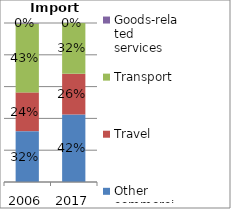
| Category | Other commercial services | Travel | Transport | Goods-related services |
|---|---|---|---|---|
| 2006.0 | 0.32 | 0.244 | 0.433 | 0.003 |
| 2017.0 | 0.425 | 0.256 | 0.319 | 0.001 |